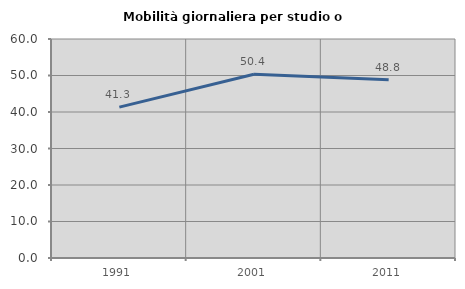
| Category | Mobilità giornaliera per studio o lavoro |
|---|---|
| 1991.0 | 41.326 |
| 2001.0 | 50.357 |
| 2011.0 | 48.845 |